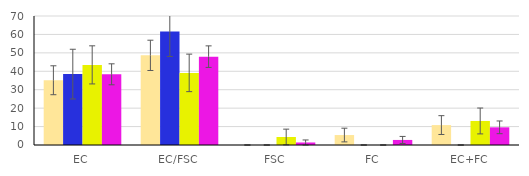
| Category | 18C | L29 | P29 sum | total |
|---|---|---|---|---|
| EC | 35.135 | 38.462 | 43.478 | 38.356 |
| EC/FSC | 48.649 | 61.538 | 39.13 | 47.945 |
| FSC | 0 | 0 | 4.348 | 1.37 |
| FC | 5.405 | 0 | 0 | 2.74 |
| EC+FC | 10.811 | 0 | 13.043 | 9.589 |